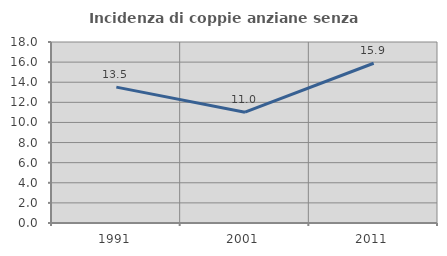
| Category | Incidenza di coppie anziane senza figli  |
|---|---|
| 1991.0 | 13.514 |
| 2001.0 | 11.017 |
| 2011.0 | 15.888 |